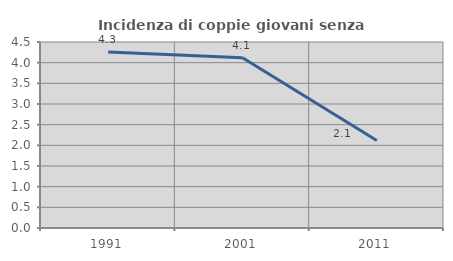
| Category | Incidenza di coppie giovani senza figli |
|---|---|
| 1991.0 | 4.257 |
| 2001.0 | 4.117 |
| 2011.0 | 2.118 |